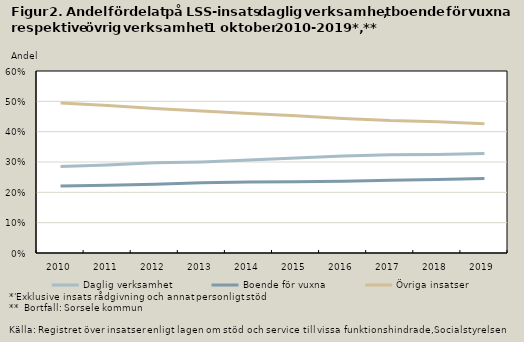
| Category | Daglig verksamhet | Boende för vuxna | Övriga insatser |
|---|---|---|---|
| 2010.0 | 0.285 | 0.221 | 0.494 |
| 2011.0 | 0.29 | 0.223 | 0.486 |
| 2012.0 | 0.297 | 0.227 | 0.476 |
| 2013.0 | 0.3 | 0.232 | 0.468 |
| 2014.0 | 0.306 | 0.234 | 0.46 |
| 2015.0 | 0.313 | 0.235 | 0.452 |
| 2016.0 | 0.32 | 0.237 | 0.444 |
| 2017.0 | 0.324 | 0.24 | 0.437 |
| 2018.0 | 0.325 | 0.242 | 0.433 |
| 2019.0 | 0.328 | 0.246 | 0.426 |